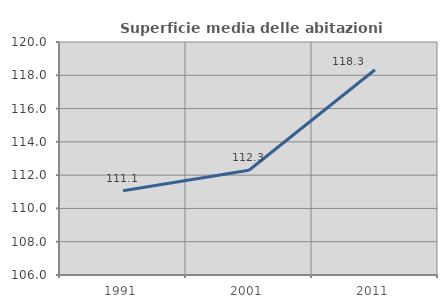
| Category | Superficie media delle abitazioni occupate |
|---|---|
| 1991.0 | 111.06 |
| 2001.0 | 112.292 |
| 2011.0 | 118.334 |